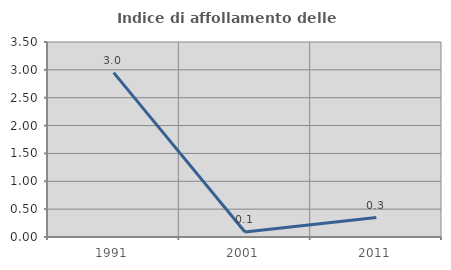
| Category | Indice di affollamento delle abitazioni  |
|---|---|
| 1991.0 | 2.951 |
| 2001.0 | 0.09 |
| 2011.0 | 0.35 |